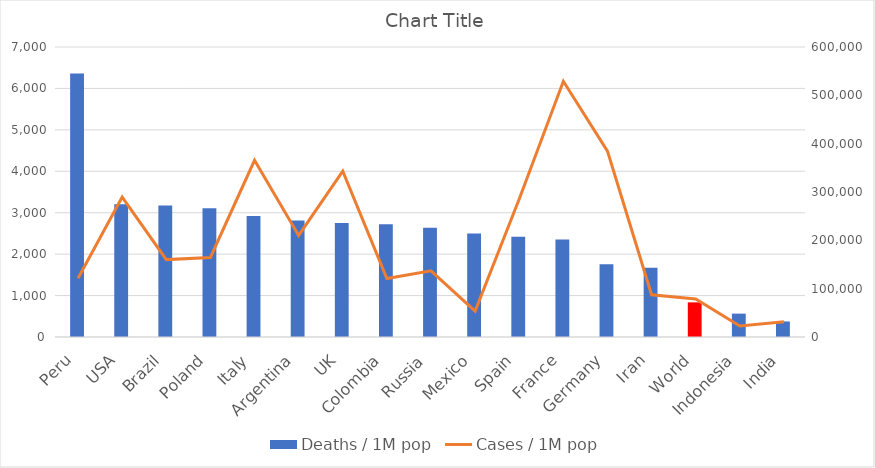
| Category | Deaths / 1M pop |
|---|---|
| Peru | 6359 |
| USA | 3207 |
| Brazil | 3173 |
| Poland | 3106 |
| Italy | 2923 |
| Argentina | 2815 |
| UK | 2753 |
| Colombia | 2722 |
| Russia | 2637 |
| Mexico | 2500 |
| Spain | 2418 |
| France | 2355 |
| Germany | 1758 |
| Iran | 1670 |
| World | 836 |
| Indonesia | 564 |
| India | 375 |